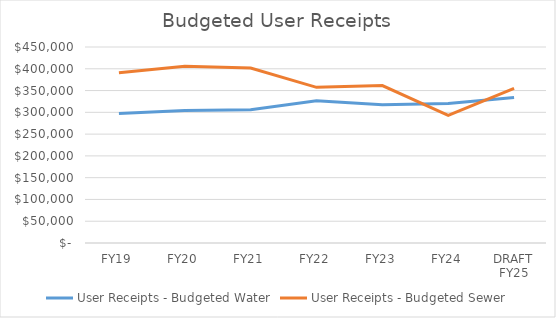
| Category | User Receipts - Budgeted Water | User Receipts - Budgeted Sewer |
|---|---|---|
| FY19 | 297500 | 391000 |
| FY20 | 304185 | 405652 |
| FY21 | 305824 | 401887 |
| FY22 | 326560 | 357337 |
| FY23 | 317547 | 361326 |
| FY24 | 320384 | 292874 |
| DRAFT FY25 | 334145 | 354900 |